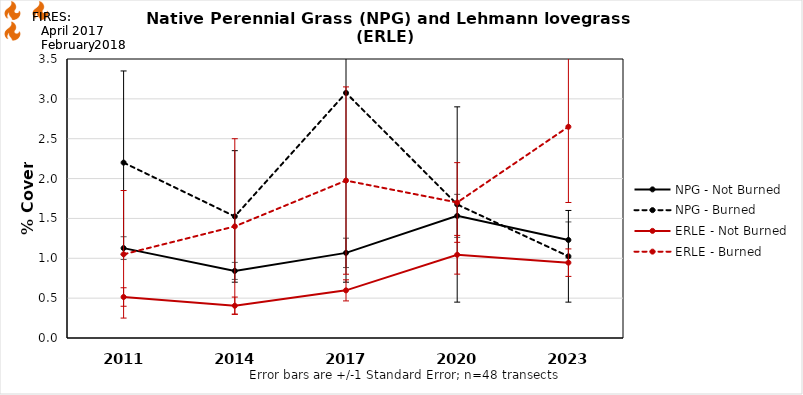
| Category | NPG - Not Burned | NPG - Burned | ERLE - Not Burned | ERLE - Burned |
|---|---|---|---|---|
| 2011.0 | 1.127 | 2.2 | 0.514 | 1.05 |
| 2014.0 | 0.842 | 1.525 | 0.405 | 1.4 |
| 2017.0 | 1.068 | 3.075 | 0.598 | 1.975 |
| 2020.0 | 1.532 | 1.675 | 1.044 | 1.7 |
| 2023.0 | 1.23 | 1.025 | 0.945 | 2.65 |